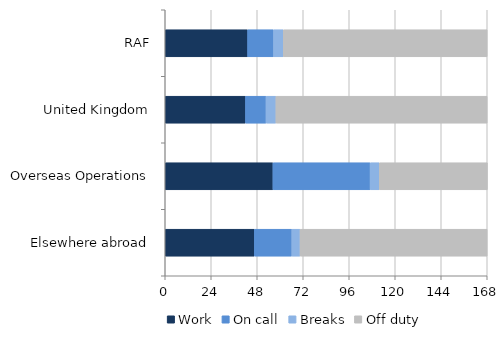
| Category | Work | On call | Breaks | Off duty |
|---|---|---|---|---|
| RAF | 42.993 | 13.531 | 5.086 | 106.375 |
| United Kingdom | 41.891 | 10.718 | 5.162 | 110.207 |
| Overseas Operations | 56.197 | 50.714 | 4.791 | 56.405 |
| Elsewhere abroad | 46.528 | 19.523 | 4.307 | 97.625 |